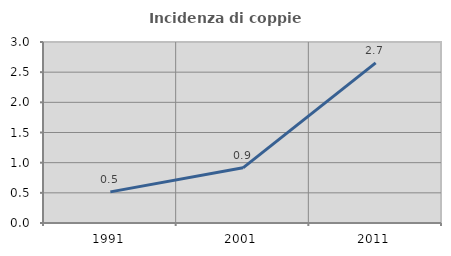
| Category | Incidenza di coppie miste |
|---|---|
| 1991.0 | 0.516 |
| 2001.0 | 0.915 |
| 2011.0 | 2.653 |